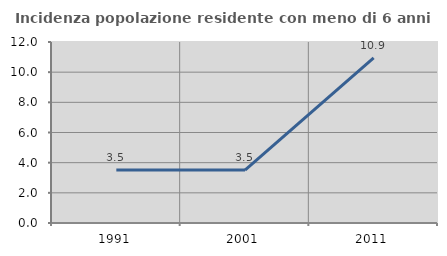
| Category | Incidenza popolazione residente con meno di 6 anni |
|---|---|
| 1991.0 | 3.509 |
| 2001.0 | 3.509 |
| 2011.0 | 10.949 |